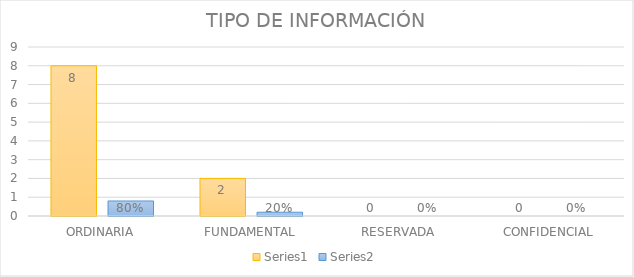
| Category | Series 3 | Series 4 |
|---|---|---|
| ORDINARIA | 8 | 0.8 |
| FUNDAMENTAL | 2 | 0.2 |
| RESERVADA | 0 | 0 |
| CONFIDENCIAL | 0 | 0 |